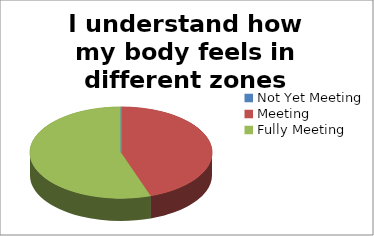
| Category | I understand how my body feels in different zones |
|---|---|
| Not Yet Meeting | 0 |
| Meeting | 17 |
| Fully Meeting | 21 |